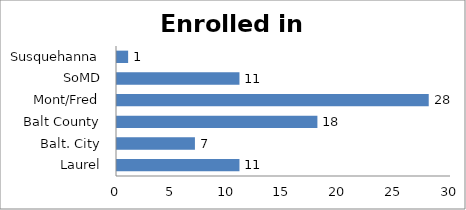
| Category | Enrolled in Training |
|---|---|
| Laurel | 11 |
| Balt. City | 7 |
| Balt County | 18 |
| Mont/Fred | 28 |
| SoMD | 11 |
| Susquehanna | 1 |